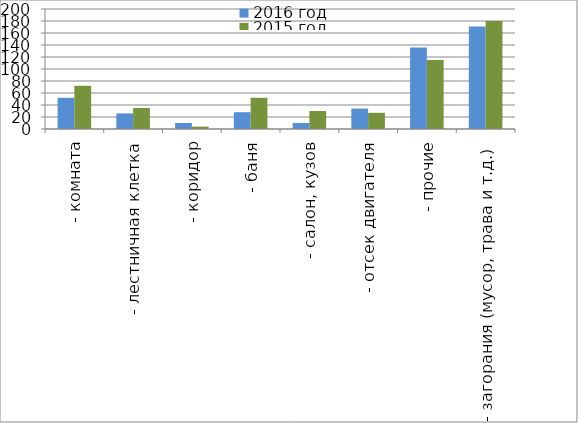
| Category | 2016 год | 2015 год |
|---|---|---|
|  - комната | 52 | 72 |
|  - лестничная клетка | 26 | 35 |
|  - коридор | 10 | 4 |
|  - баня | 28 | 52 |
|  - салон, кузов | 10 | 30 |
|  - отсек двигателя | 34 | 27 |
| - прочие | 136 | 115 |
| - загорания (мусор, трава и т.д.)  | 171 | 180 |